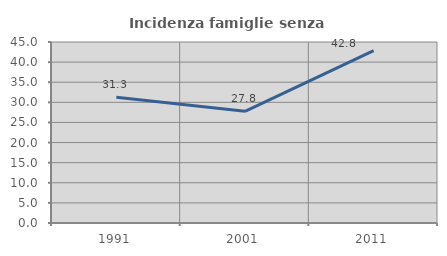
| Category | Incidenza famiglie senza nuclei |
|---|---|
| 1991.0 | 31.281 |
| 2001.0 | 27.765 |
| 2011.0 | 42.841 |